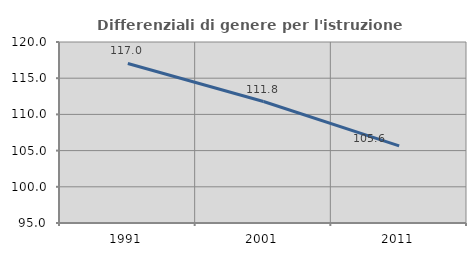
| Category | Differenziali di genere per l'istruzione superiore |
|---|---|
| 1991.0 | 117.032 |
| 2001.0 | 111.777 |
| 2011.0 | 105.649 |